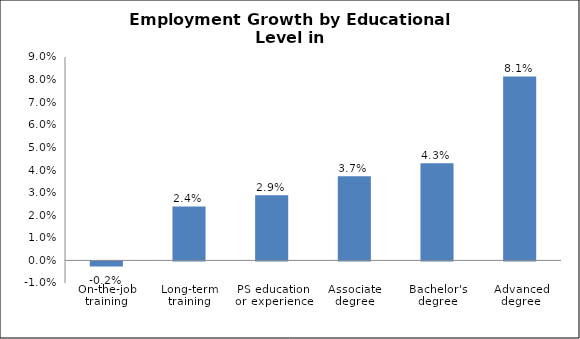
| Category | Series 0 |
|---|---|
| On-the-job training | -0.002 |
| Long-term training | 0.024 |
| PS education or experience | 0.029 |
| Associate degree | 0.037 |
| Bachelor's degree | 0.043 |
| Advanced degree | 0.081 |